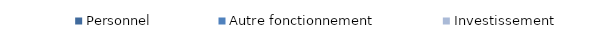
| Category | Personnel | Autre fonctionnement | Investissement |
|---|---|---|---|
| 2012 | 8.119 | 5.611 | 3.684 |
| 2013 | 8.612 | 5.926 | 3.864 |
| 2014 | 9.102 | 5.84 | 3.281 |
| 2015p | 9.267 | 5.576 | 2.838 |